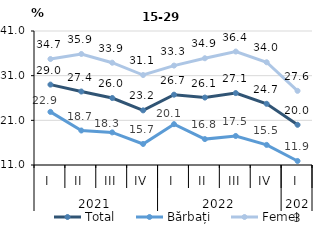
| Category | Total | Bărbați | Femei |
|---|---|---|---|
| 0 | 28.999 | 22.886 | 34.731 |
| 1 | 27.448 | 18.722 | 35.856 |
| 2 | 26 | 18.3 | 33.9 |
| 3 | 23.232 | 15.71 | 31.142 |
| 4 | 26.744 | 20.142 | 33.259 |
| 5 | 26.1 | 16.8 | 34.9 |
| 6 | 27.1 | 17.5 | 36.4 |
| 7 | 24.7 | 15.5 | 34 |
| 8 | 20 | 11.9 | 27.6 |